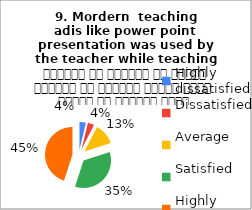
| Category |  9. Mordern  teaching 
adis like power point presentation was used by the teacher while teaching  शिक्षक ने शिक्षण के दौरान शिक्षण की आधुनिक तकनीक पावर पॉइंट का प्रयोग किया |
|---|---|
| Highly dissatisfied | 3 |
| Dissatisfied | 3 |
| Average | 10 |
| Satisfied | 28 |
| Highly satisfied | 36 |